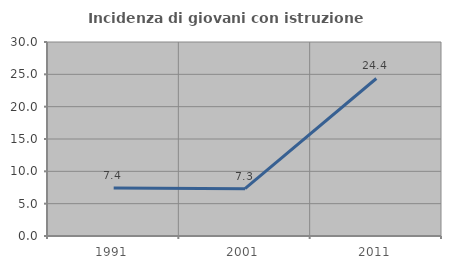
| Category | Incidenza di giovani con istruzione universitaria |
|---|---|
| 1991.0 | 7.432 |
| 2001.0 | 7.317 |
| 2011.0 | 24.359 |